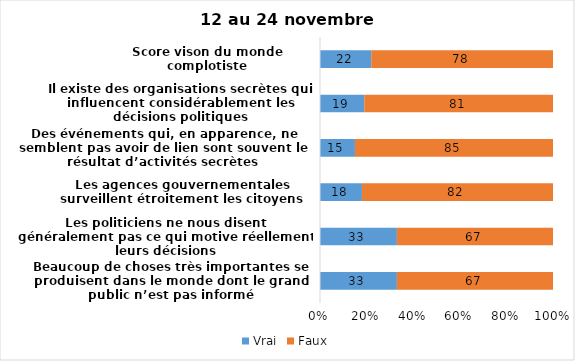
| Category | Vrai | Faux |
|---|---|---|
| Beaucoup de choses très importantes se produisent dans le monde dont le grand public n’est pas informé | 33 | 67 |
| Les politiciens ne nous disent généralement pas ce qui motive réellement leurs décisions | 33 | 67 |
| Les agences gouvernementales surveillent étroitement les citoyens | 18 | 82 |
| Des événements qui, en apparence, ne semblent pas avoir de lien sont souvent le résultat d’activités secrètes | 15 | 85 |
| Il existe des organisations secrètes qui influencent considérablement les décisions politiques | 19 | 81 |
| Score vison du monde complotiste | 22 | 78 |